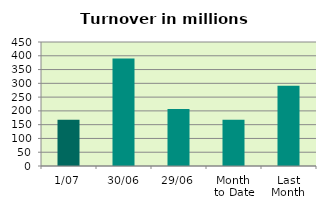
| Category | Series 0 |
|---|---|
| 1/07 | 168.013 |
| 30/06 | 389.939 |
| 29/06 | 206.501 |
| Month 
to Date | 168.013 |
| Last
Month | 290.981 |